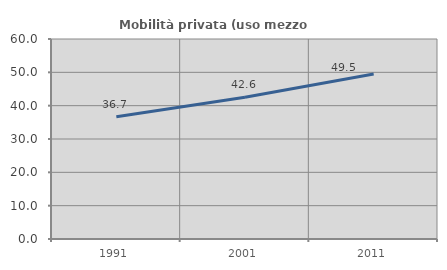
| Category | Mobilità privata (uso mezzo privato) |
|---|---|
| 1991.0 | 36.693 |
| 2001.0 | 42.553 |
| 2011.0 | 49.491 |